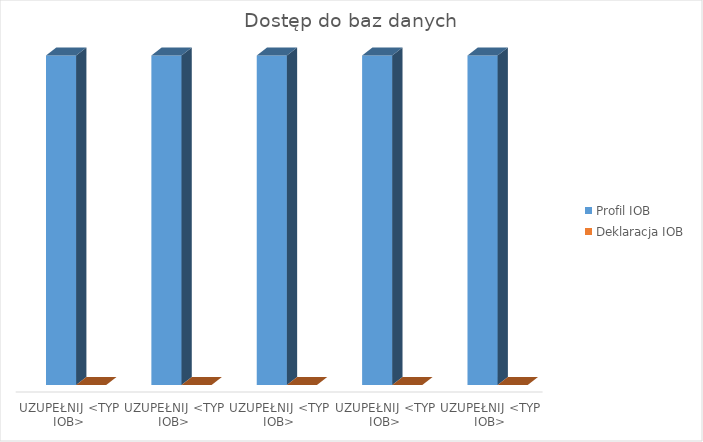
| Category | Profil IOB | Deklaracja IOB |
|---|---|---|
| UZUPEŁNIJ <TYP IOB> | 1 | 0 |
| UZUPEŁNIJ <TYP IOB> | 1 | 0 |
| UZUPEŁNIJ <TYP IOB> | 1 | 0 |
| UZUPEŁNIJ <TYP IOB> | 1 | 0 |
| UZUPEŁNIJ <TYP IOB> | 1 | 0 |